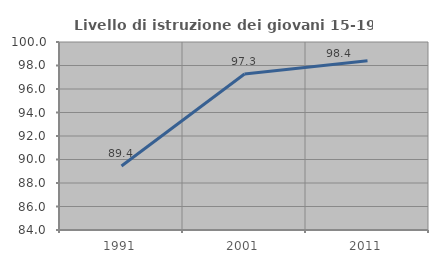
| Category | Livello di istruzione dei giovani 15-19 anni |
|---|---|
| 1991.0 | 89.441 |
| 2001.0 | 97.283 |
| 2011.0 | 98.396 |